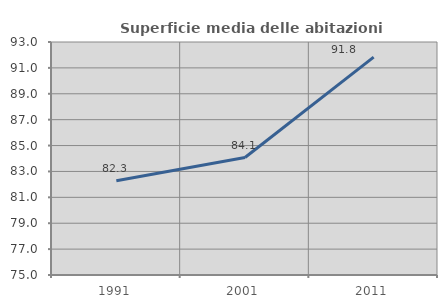
| Category | Superficie media delle abitazioni occupate |
|---|---|
| 1991.0 | 82.282 |
| 2001.0 | 84.076 |
| 2011.0 | 91.834 |